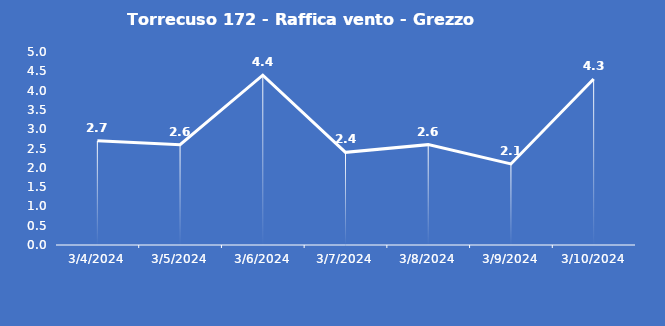
| Category | Torrecuso 172 - Raffica vento - Grezzo (m/s) |
|---|---|
| 3/4/24 | 2.7 |
| 3/5/24 | 2.6 |
| 3/6/24 | 4.4 |
| 3/7/24 | 2.4 |
| 3/8/24 | 2.6 |
| 3/9/24 | 2.1 |
| 3/10/24 | 4.3 |